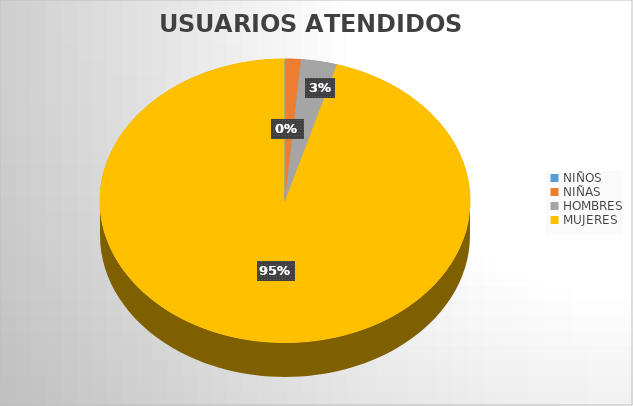
| Category | USUARIOS ATENDIDOS  |
|---|---|
| NIÑOS  | 0 |
| NIÑAS | 10 |
| HOMBRES | 23 |
| MUJERES | 698 |